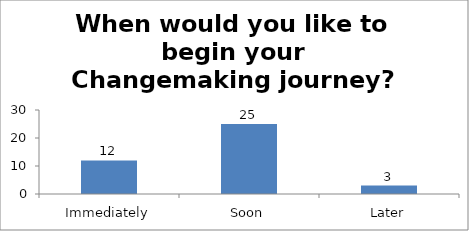
| Category | When would you like to begin your Changemaking journey?  |
|---|---|
| Immediately | 12 |
| Soon | 25 |
| Later | 3 |